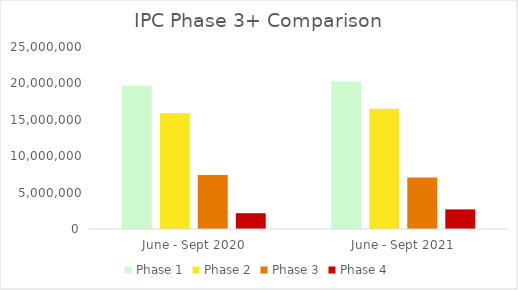
| Category | Phase 1 | Phase 2 | Phase 3 | Phase 4 |
|---|---|---|---|---|
| June - Sept 2020 | 19728053 | 15891371 | 7410682 | 2168003 |
| June - Sept 2021 | 20273467.172 | 16525735.974 | 7072837.718 | 2696783.256 |